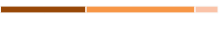
| Category | Series 0 | Series 1 | Series 2 |
|---|---|---|---|
| 0 | 0.393 | 0.5 | 0.107 |